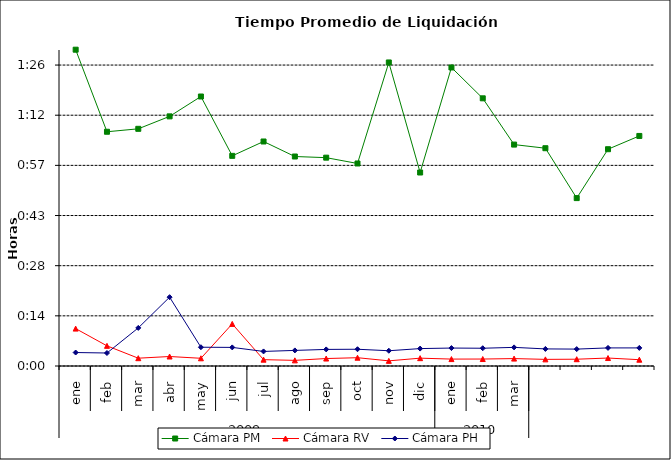
| Category | Cámara PM | Cámara RV | Cámara PH |
|---|---|---|---|
| 0 | 0.063 | 0.007 | 0.003 |
| 1 | 0.047 | 0.004 | 0.003 |
| 2 | 0.047 | 0.002 | 0.008 |
| 3 | 0.05 | 0.002 | 0.014 |
| 4 | 0.054 | 0.002 | 0.004 |
| 5 | 0.042 | 0.008 | 0.004 |
| 6 | 0.045 | 0.001 | 0.003 |
| 7 | 0.042 | 0.001 | 0.003 |
| 8 | 0.042 | 0.001 | 0.003 |
| 9 | 0.04 | 0.002 | 0.003 |
| 10 | 0.061 | 0.001 | 0.003 |
| 11 | 0.039 | 0.002 | 0.003 |
| 12 | 0.06 | 0.001 | 0.004 |
| 13 | 0.053 | 0.001 | 0.004 |
| 14 | 0.044 | 0.001 | 0.004 |
| 15 | 0.043 | 0.001 | 0.003 |
| 16 | 0.033 | 0.001 | 0.003 |
| 17 | 0.043 | 0.002 | 0.004 |
| 18 | 0.046 | 0.001 | 0.004 |